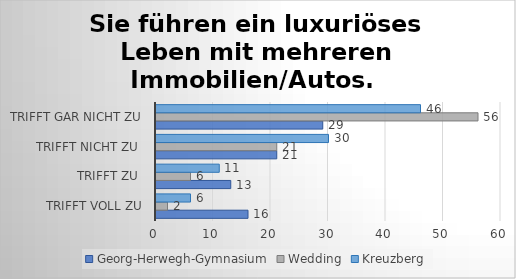
| Category | Georg-Herwegh-Gymnasium | Wedding | Kreuzberg |
|---|---|---|---|
| trifft voll zu | 16 | 2 | 6 |
| trifft zu  | 13 | 6 | 11 |
| trifft nicht zu  | 21 | 21 | 30 |
| trifft gar nicht zu | 29 | 56 | 46 |